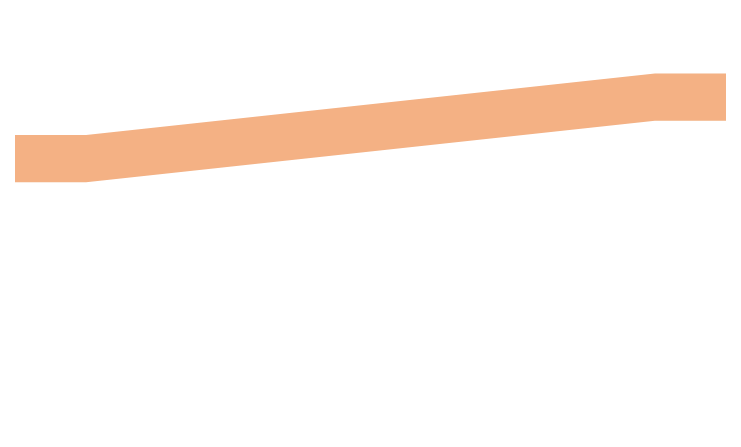
| Category | Series 0 | Series 1 | Series 2 |
|---|---|---|---|
| 0.0 | 1153.707 | 454.741 | 2404.713 |
| 10.0 | 1153.707 | 454.741 | 2404.713 |
| 90.0 | 562.448 | 454.741 | 2995.971 |
| 100.0 | 562.448 | 454.741 | 2995.971 |